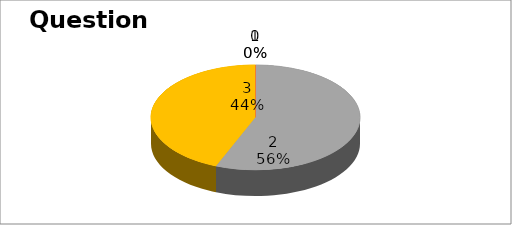
| Category | Series 0 |
|---|---|
| 0 | 0 |
| 1 | 0 |
| 2 | 73 |
| 3 | 57 |